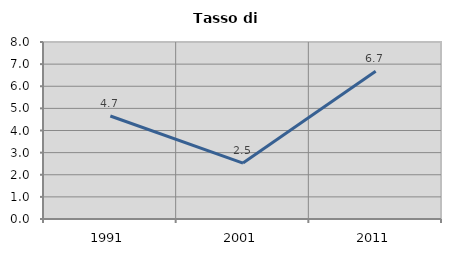
| Category | Tasso di disoccupazione   |
|---|---|
| 1991.0 | 4.655 |
| 2001.0 | 2.527 |
| 2011.0 | 6.676 |